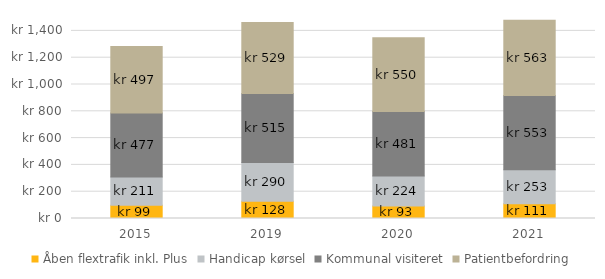
| Category | Åben flextrafik inkl. Plus | Handicap kørsel | Kommunal visiteret | Patientbefordring |
|---|---|---|---|---|
| 2015.0 | 99 | 211 | 477 | 497 |
| 2019.0 | 128 | 290 | 515 | 529 |
| 2020.0 | 93 | 224 | 481 | 550 |
| 2021.0 | 111 | 253 | 553 | 563 |